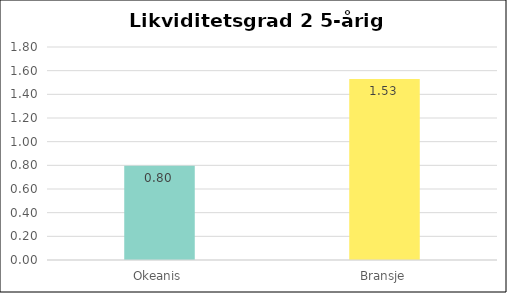
| Category | Series 0 |
|---|---|
| Okeanis | 0.798 |
| Bransje | 1.53 |